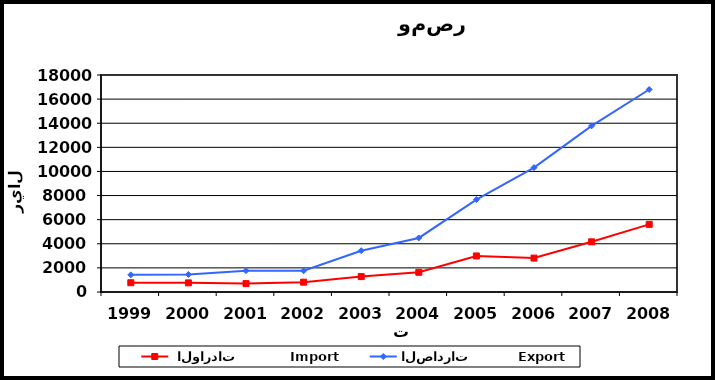
| Category |  الواردات           Import | الصادرات          Export |
|---|---|---|
| 1999.0 | 769 | 1421 |
| 2000.0 | 757 | 1455 |
| 2001.0 | 696 | 1768 |
| 2002.0 | 815 | 1757 |
| 2003.0 | 1277 | 3427 |
| 2004.0 | 1635 | 4484 |
| 2005.0 | 2989 | 7666 |
| 2006.0 | 2814 | 10320 |
| 2007.0 | 4163 | 13779 |
| 2008.0 | 5612 | 16799 |